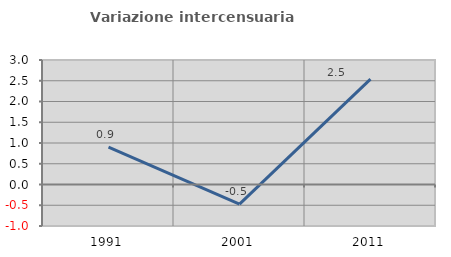
| Category | Variazione intercensuaria annua |
|---|---|
| 1991.0 | 0.902 |
| 2001.0 | -0.475 |
| 2011.0 | 2.539 |